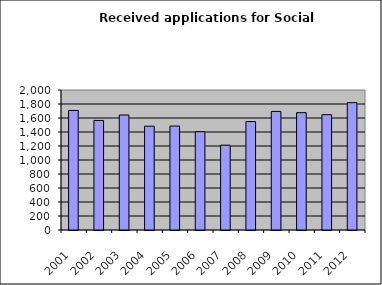
| Category | Series 0 |
|---|---|
| 2001.0 | 1708 |
| 2002.0 | 1565 |
| 2003.0 | 1643 |
| 2004.0 | 1483 |
| 2005.0 | 1485 |
| 2006.0 | 1405 |
| 2007.0 | 1212 |
| 2008.0 | 1549 |
| 2009.0 | 1694 |
| 2010.0 | 1676 |
| 2011.0 | 1647 |
| 2012.0 | 1819 |